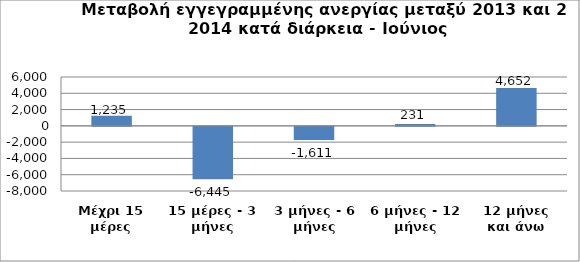
| Category | Series 0 |
|---|---|
| Μέχρι 15 μέρες | 1235 |
| 15 μέρες - 3 μήνες | -6445 |
| 3 μήνες - 6 μήνες | -1611 |
| 6 μήνες - 12 μήνες | 231 |
| 12 μήνες και άνω | 4652 |